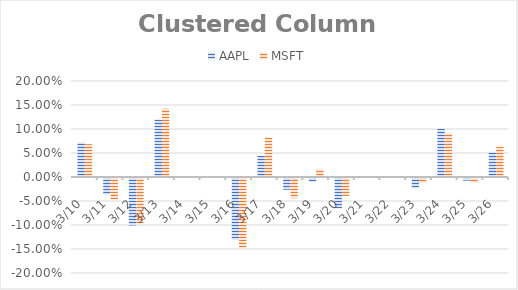
| Category | AAPL | MSFT |
|---|---|---|
| 2020-03-10 | 0.072 | 0.068 |
| 2020-03-11 | -0.035 | -0.045 |
| 2020-03-12 | -0.099 | -0.095 |
| 2020-03-13 | 0.12 | 0.142 |
| 2020-03-16 | -0.129 | -0.147 |
| 2020-03-17 | 0.044 | 0.082 |
| 2020-03-18 | -0.024 | -0.042 |
| 2020-03-19 | -0.008 | 0.016 |
| 2020-03-20 | -0.063 | -0.038 |
| 2020-03-23 | -0.021 | -0.01 |
| 2020-03-24 | 0.1 | 0.091 |
| 2020-03-25 | -0.006 | -0.01 |
| 2020-03-26 | 0.053 | 0.063 |